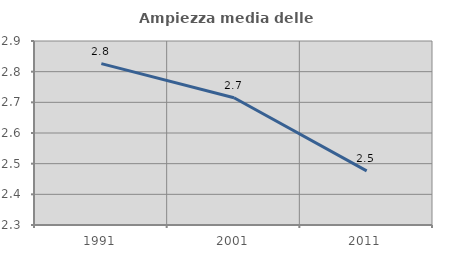
| Category | Ampiezza media delle famiglie |
|---|---|
| 1991.0 | 2.826 |
| 2001.0 | 2.715 |
| 2011.0 | 2.476 |